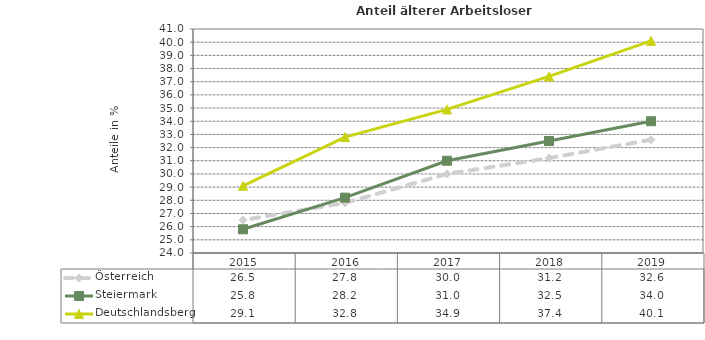
| Category | Österreich | Steiermark | Deutschlandsberg |
|---|---|---|---|
| 2019.0 | 32.6 | 34 | 40.1 |
| 2018.0 | 31.2 | 32.5 | 37.4 |
| 2017.0 | 30 | 31 | 34.9 |
| 2016.0 | 27.8 | 28.2 | 32.8 |
| 2015.0 | 26.5 | 25.8 | 29.1 |